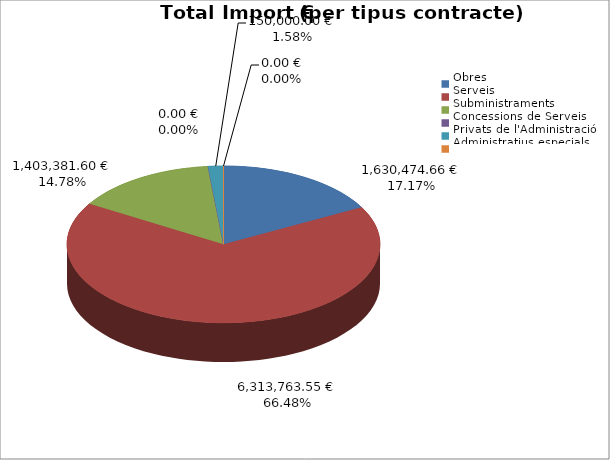
| Category | Total preu
(amb IVA) |
|---|---|
| Obres | 1630474.66 |
| Serveis | 6313763.55 |
| Subministraments | 1403381.6 |
| Concessions de Serveis | 0 |
| Privats de l'Administració | 150000 |
| Administratius especials | 0 |